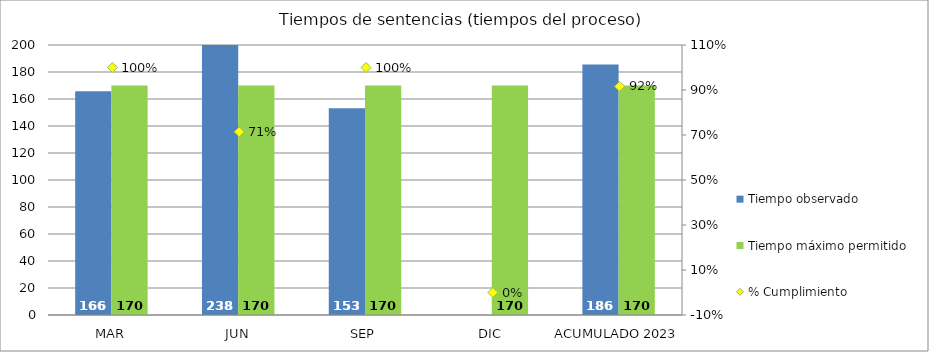
| Category | Tiempo observado | Tiempo máximo permitido |
|---|---|---|
| MAR | 165.7 | 170 |
| JUN | 238.1 | 170 |
| SEP | 153.1 | 170 |
| DIC | 0 | 170 |
| ACUMULADO 2023 | 185.633 | 170 |